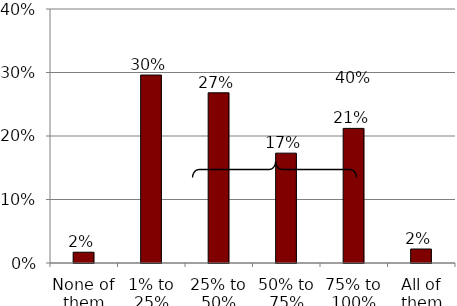
| Category | Series 0 |
|---|---|
| None of them | 0.017 |
| 1% to 25% | 0.296 |
| 25% to 50% | 0.268 |
| 50% to 75% | 0.173 |
| 75% to 100% | 0.212 |
| All of them | 0.022 |